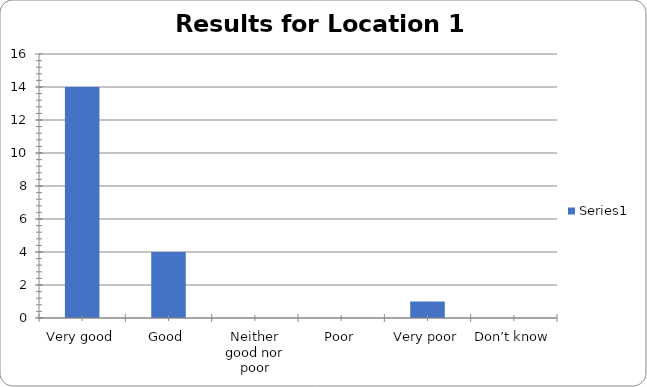
| Category | Series 0 |
|---|---|
| Very good | 14 |
| Good | 4 |
| Neither good nor poor | 0 |
| Poor | 0 |
| Very poor | 1 |
| Don’t know | 0 |